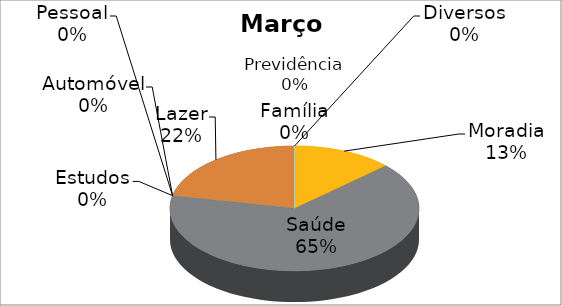
| Category | Março | Janeiro |
|---|---|---|
| Moradia | 600 | 4020 |
| Saúde | 3000 | 100 |
| Estudos | 0 | 680 |
| Automóvel | 0 | 1230 |
| Pessoal | 0 | 640 |
| Lazer | 1000 | 400 |
| Família | 0 | 700 |
| Previdência | 0 | 0 |
| Diversos | 0 | 0 |